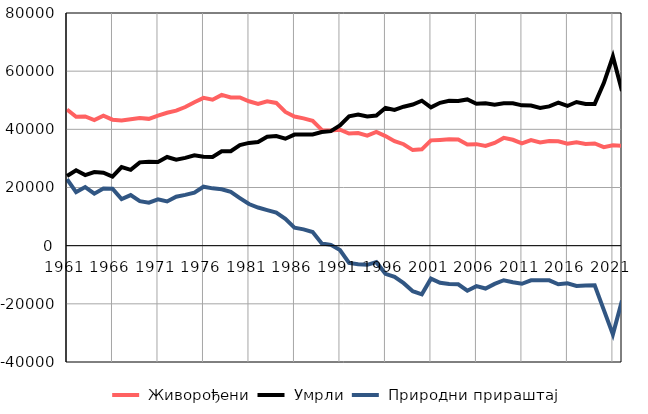
| Category |  Живорођени |  Умрли |  Природни прираштај |
|---|---|---|---|
| 1961.0 | 46788 | 23930 | 22858 |
| 1962.0 | 44342 | 25923 | 18419 |
| 1963.0 | 44412 | 24268 | 20144 |
| 1964.0 | 43204 | 25319 | 17885 |
| 1965.0 | 44704 | 25086 | 19618 |
| 1966.0 | 43324 | 23724 | 19600 |
| 1967.0 | 43064 | 27030 | 16034 |
| 1968.0 | 43467 | 26079 | 17388 |
| 1969.0 | 43926 | 28639 | 15287 |
| 1970.0 | 43601 | 28826 | 14775 |
| 1971.0 | 44720 | 28796 | 15924 |
| 1972.0 | 45712 | 30498 | 15214 |
| 1973.0 | 46406 | 29561 | 16845 |
| 1974.0 | 47665 | 30198 | 17467 |
| 1975.0 | 49341 | 31096 | 18245 |
| 1976.0 | 50819 | 30547 | 20272 |
| 1977.0 | 50183 | 30476 | 19707 |
| 1978.0 | 51837 | 32438 | 19399 |
| 1979.0 | 50971 | 32470 | 18501 |
| 1980.0 | 50958 | 34601 | 16357 |
| 1981.0 | 49642 | 35329 | 14313 |
| 1982.0 | 48752 | 35636 | 13116 |
| 1983.0 | 49671 | 37430 | 12241 |
| 1984.0 | 49071 | 37676 | 11395 |
| 1985.0 | 45976 | 36768 | 9208 |
| 1986.0 | 44402 | 38201 | 6201 |
| 1987.0 | 43783 | 38193 | 5590 |
| 1988.0 | 42954 | 38252 | 4702 |
| 1989.0 | 39803 | 39056 | 747 |
| 1990.0 | 39640 | 39365 | 275 |
| 1991.0 | 39877 | 41373 | -1496 |
| 1992.0 | 38545 | 44495 | -5950 |
| 1993.0 | 38703 | 45074 | -6371 |
| 1994.0 | 37833 | 44419 | -6586 |
| 1995.0 | 39089 | 44763 | -5674 |
| 1996.0 | 37676 | 47349 | -9673 |
| 1997.0 | 35929 | 46658 | -10729 |
| 1998.0 | 34881 | 47784 | -12903 |
| 1999.0 | 32868 | 48545 | -15677 |
| 2000.0 | 33116 | 49834 | -16718 |
| 2001.0 | 36204 | 47542 | -11338 |
| 2002.0 | 36372 | 49127 | -12755 |
| 2003.0 | 36581 | 49786 | -13205 |
| 2004.0 | 36482 | 49757 | -13275 |
| 2005.0 | 34785 | 50279 | -15494 |
| 2006.0 | 34904 | 48817 | -13913 |
| 2007.0 | 34267 | 48999 | -14732 |
| 2008.0 | 35339 | 48494 | -13155 |
| 2009.0 | 37053 | 48934 | -11881 |
| 2010.0 | 36407 | 48965 | -12558 |
| 2011.0 | 35148 | 48245 | -13097 |
| 2012.0 | 36294 | 48195 | -11901 |
| 2013.0 | 35457 | 47323 | -11866 |
| 2014.0 | 35962 | 47881 | -11919 |
| 2015.0 | 35889 | 49179 | -13290 |
| 2016.0 | 35074 | 48037 | -12963 |
| 2017.0 | 35564 | 49402 | -13838 |
| 2018.0 | 34986 | 48723 | -13737 |
| 2019.0 | 35138 | 48745 | -13607 |
| 2020.0 | 33849 | 55920 | -22071 |
| 2021.0 | 34540 | 65043 | -30503 |
| 2022.0 | 34317 | 53214 | -18897 |